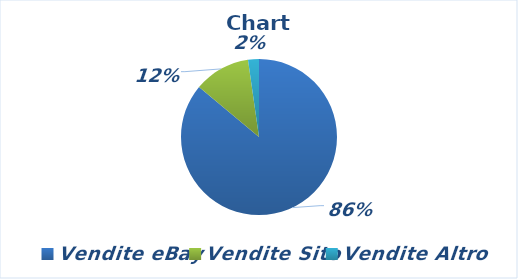
| Category | Series 0 |
|---|---|
| Vendite eBay | 4759.79 |
| Vendite Sito | 646.99 |
| Vendite Altro | 124.82 |